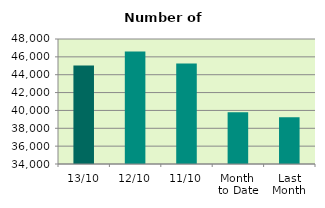
| Category | Series 0 |
|---|---|
| 13/10 | 45038 |
| 12/10 | 46610 |
| 11/10 | 45252 |
| Month 
to Date | 39793.333 |
| Last
Month | 39229.818 |